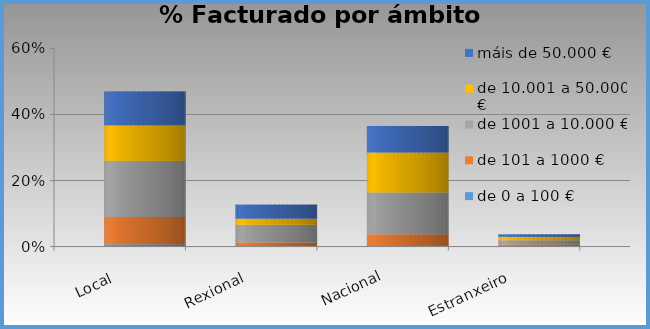
| Category | de 0 a 100 € | de 101 a 1000 € | de 1001 a 10.000 € | de 10.001 a 50.000 € | máis de 50.000 € |
|---|---|---|---|---|---|
| Local | 0.007 | 0.083 | 0.17 | 0.108 | 0.103 |
| Rexional | 0.001 | 0.012 | 0.053 | 0.018 | 0.043 |
| Nacional | 0.004 | 0.033 | 0.127 | 0.121 | 0.08 |
| Estranxeiro | 0 | 0.006 | 0.013 | 0.01 | 0.007 |